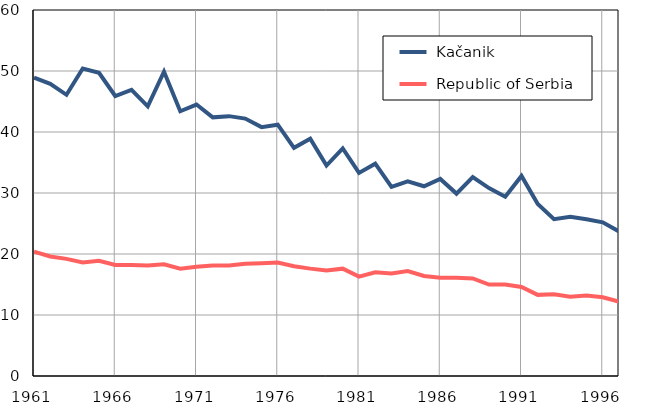
| Category |  Kačanik |  Republic of Serbia |
|---|---|---|
| 1961.0 | 48.9 | 20.4 |
| 1962.0 | 47.9 | 19.6 |
| 1963.0 | 46.1 | 19.2 |
| 1964.0 | 50.4 | 18.6 |
| 1965.0 | 49.7 | 18.9 |
| 1966.0 | 45.9 | 18.2 |
| 1967.0 | 46.9 | 18.2 |
| 1968.0 | 44.2 | 18.1 |
| 1969.0 | 49.9 | 18.3 |
| 1970.0 | 43.4 | 17.6 |
| 1971.0 | 44.5 | 17.9 |
| 1972.0 | 42.4 | 18.1 |
| 1973.0 | 42.6 | 18.1 |
| 1974.0 | 42.2 | 18.4 |
| 1975.0 | 40.8 | 18.5 |
| 1976.0 | 41.2 | 18.6 |
| 1977.0 | 37.4 | 18 |
| 1978.0 | 38.9 | 17.6 |
| 1979.0 | 34.5 | 17.3 |
| 1980.0 | 37.3 | 17.6 |
| 1981.0 | 33.3 | 16.3 |
| 1982.0 | 34.8 | 17 |
| 1983.0 | 31 | 16.8 |
| 1984.0 | 31.9 | 17.2 |
| 1985.0 | 31.1 | 16.4 |
| 1986.0 | 32.3 | 16.1 |
| 1987.0 | 29.9 | 16.1 |
| 1988.0 | 32.6 | 16 |
| 1989.0 | 30.8 | 15 |
| 1990.0 | 29.4 | 15 |
| 1991.0 | 32.8 | 14.6 |
| 1992.0 | 28.2 | 13.3 |
| 1993.0 | 25.7 | 13.4 |
| 1994.0 | 26.1 | 13 |
| 1995.0 | 25.7 | 13.2 |
| 1996.0 | 25.2 | 12.9 |
| 1997.0 | 23.7 | 12.2 |